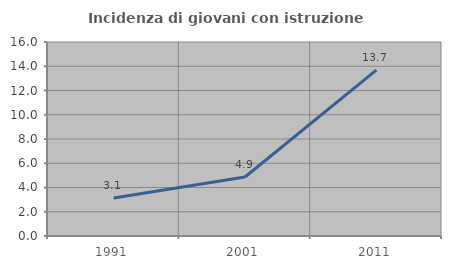
| Category | Incidenza di giovani con istruzione universitaria |
|---|---|
| 1991.0 | 3.141 |
| 2001.0 | 4.867 |
| 2011.0 | 13.684 |